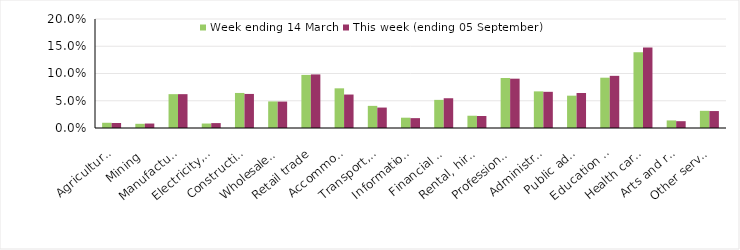
| Category | Week ending 14 March | This week (ending 05 September) |
|---|---|---|
| Agriculture, forestry and fishing | 0.01 | 0.009 |
| Mining | 0.008 | 0.008 |
| Manufacturing | 0.062 | 0.062 |
| Electricity, gas, water and waste services | 0.008 | 0.009 |
| Construction | 0.064 | 0.062 |
| Wholesale trade | 0.049 | 0.048 |
| Retail trade | 0.097 | 0.098 |
| Accommodation and food services | 0.073 | 0.061 |
| Transport, postal and warehousing | 0.041 | 0.038 |
| Information media and telecommunications | 0.019 | 0.018 |
| Financial and insurance services | 0.052 | 0.055 |
| Rental, hiring and real estate services | 0.022 | 0.022 |
| Professional, scientific and technical services | 0.092 | 0.09 |
| Administrative and support services | 0.067 | 0.066 |
| Public administration and safety | 0.059 | 0.064 |
| Education and training | 0.092 | 0.096 |
| Health care and social assistance | 0.139 | 0.148 |
| Arts and recreation services | 0.014 | 0.012 |
| Other services | 0.032 | 0.031 |